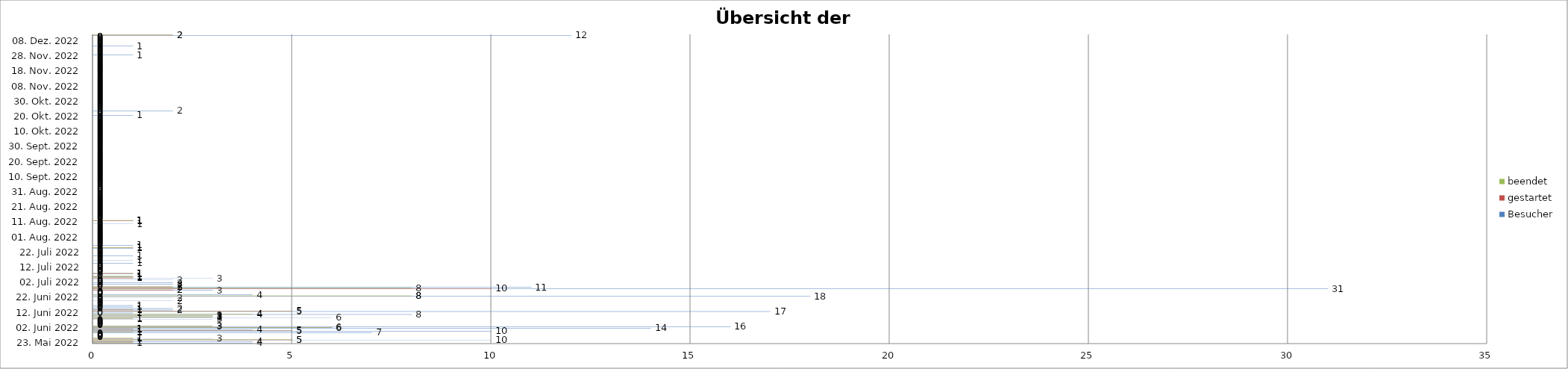
| Category | Besucher | gestartet | beendet |
|---|---|---|---|
| 23. Mai 2022 | 4 | 1 | 1 |
| 24. Mai 2022 | 4 | 1 | 1 |
| 25. Mai 2022 | 10 | 5 | 5 |
| 26. Mai 2022 | 3 | 1 | 1 |
| 27. Mai 2022 | 0 | 0 | 0 |
| 28. Mai 2022 | 0 | 0 | 0 |
| 29. Mai 2022 | 0 | 0 | 0 |
| 30. Mai 2022 | 7 | 1 | 1 |
| 31. Mai 2022 | 10 | 5 | 5 |
| 01. Juni 2022 | 4 | 1 | 1 |
| 02. Juni 2022 | 14 | 6 | 6 |
| 03. Juni 2022 | 16 | 3 | 3 |
| 04. Juni 2022 | 0 | 0 | 0 |
| 05. Juni 2022 | 0 | 0 | 0 |
| 06. Juni 2022 | 0 | 0 | 0 |
| 07. Juni 2022 | 0 | 0 | 0 |
| 08. Juni 2022 | 3 | 1 | 1 |
| 09. Juni 2022 | 6 | 3 | 3 |
| 10. Juni 2022 | 3 | 3 | 3 |
| 11. Juni 2022 | 8 | 4 | 4 |
| 12. Juni 2022 | 1 | 0 | 0 |
| 13. Juni 2022 | 17 | 5 | 5 |
| 14. Juni 2022 | 2 | 1 | 1 |
| 15. Juni 2022 | 2 | 0 | 0 |
| 16. Juni 2022 | 1 | 0 | 0 |
| 17. Juni 2022 | 1 | 0 | 0 |
| 18. Juni 2022 | 0 | 0 | 0 |
| 19. Juni 2022 | 0 | 0 | 0 |
| 20. Juni 2022 | 2 | 0 | 0 |
| 21. Juni 2022 | 0 | 0 | 0 |
| 22. Juni 2022 | 2 | 0 | 0 |
| 23. Juni 2022 | 18 | 8 | 8 |
| 24. Juni 2022 | 4 | 0 | 0 |
| 25. Juni 2022 | 0 | 0 | 0 |
| 26. Juni 2022 | 0 | 0 | 0 |
| 27. Juni 2022 | 3 | 2 | 2 |
| 28. Juni 2022 | 31 | 10 | 8 |
| 29. Juni 2022 | 11 | 2 | 2 |
| 30. Juni 2022 | 0 | 0 | 0 |
| 01. Juli 2022 | 2 | 0 | 0 |
| 02. Juli 2022 | 2 | 0 | 0 |
| 03. Juli 2022 | 0 | 0 | 0 |
| 04. Juli 2022 | 2 | 0 | 0 |
| 05. Juli 2022 | 3 | 1 | 1 |
| 06. Juli 2022 | 1 | 1 | 1 |
| 07. Juli 2022 | 0 | 0 | 0 |
| 08. Juli 2022 | 1 | 1 | 1 |
| 09. Juli 2022 | 0 | 0 | 0 |
| 10. Juli 2022 | 0 | 0 | 0 |
| 11. Juli 2022 | 0 | 0 | 0 |
| 12. Juli 2022 | 0 | 0 | 0 |
| 13. Juli 2022 | 0 | 0 | 0 |
| 14. Juli 2022 | 0 | 0 | 0 |
| 15. Juli 2022 | 1 | 0 | 0 |
| 16. Juli 2022 | 0 | 0 | 0 |
| 17. Juli 2022 | 1 | 0 | 0 |
| 18. Juli 2022 | 0 | 0 | 0 |
| 19. Juli 2022 | 0 | 0 | 0 |
| 20. Juli 2022 | 1 | 0 | 0 |
| 21. Juli 2022 | 0 | 0 | 0 |
| 22. Juli 2022 | 0 | 0 | 0 |
| 23. Juli 2022 | 0 | 0 | 0 |
| 24. Juli 2022 | 0 | 0 | 0 |
| 25. Juli 2022 | 1 | 1 | 1 |
| 26. Juli 2022 | 0 | 0 | 0 |
| 27. Juli 2022 | 1 | 0 | 0 |
| 28. Juli 2022 | 0 | 0 | 0 |
| 29. Juli 2022 | 0 | 0 | 0 |
| 30. Juli 2022 | 0 | 0 | 0 |
| 31. Juli 2022 | 0 | 0 | 0 |
| 01. Aug. 2022 | 0 | 0 | 0 |
| 02. Aug. 2022 | 0 | 0 | 0 |
| 03. Aug. 2022 | 0 | 0 | 0 |
| 04. Aug. 2022 | 0 | 0 | 0 |
| 05. Aug. 2022 | 0 | 0 | 0 |
| 06. Aug. 2022 | 0 | 0 | 0 |
| 07. Aug. 2022 | 0 | 0 | 0 |
| 08. Aug. 2022 | 0 | 0 | 0 |
| 09. Aug. 2022 | 0 | 0 | 0 |
| 10. Aug. 2022 | 1 | 0 | 0 |
| 11. Aug. 2022 | 0 | 0 | 0 |
| 12. Aug. 2022 | 1 | 1 | 1 |
| 13. Aug. 2022 | 0 | 0 | 0 |
| 14. Aug. 2022 | 0 | 0 | 0 |
| 15. Aug. 2022 | 0 | 0 | 0 |
| 16. Aug. 2022 | 0 | 0 | 0 |
| 17. Aug. 2022 | 0 | 0 | 0 |
| 18. Aug. 2022 | 0 | 0 | 0 |
| 19. Aug. 2022 | 0 | 0 | 0 |
| 20. Aug. 2022 | 0 | 0 | 0 |
| 21. Aug. 2022 | 0 | 0 | 0 |
| 22. Aug. 2022 | 0 | 0 | 0 |
| 23. Aug. 2022 | 0 | 0 | 0 |
| 24. Aug. 2022 | 0 | 0 | 0 |
| 25. Aug. 2022 | 0 | 0 | 0 |
| 26. Aug. 2022 | 0 | 0 | 0 |
| 27. Aug. 2022 | 0 | 0 | 0 |
| 28. Aug. 2022 | 0 | 0 | 0 |
| 29. Aug. 2022 | 0 | 0 | 0 |
| 30. Aug. 2022 | 0 | 0 | 0 |
| 31. Aug. 2022 | 0 | 0 | 0 |
| 01. Sept. 2022 | 0 | 0 | 0 |
| 02. Sept. 2022 | 0 | 0 | 0 |
| 03. Sept. 2022 | 0 | 0 | 0 |
| 04. Sept. 2022 | 0 | 0 | 0 |
| 05. Sept. 2022 | 0 | 0 | 0 |
| 06. Sept. 2022 | 0 | 0 | 0 |
| 07. Sept. 2022 | 0 | 0 | 0 |
| 08. Sept. 2022 | 0 | 0 | 0 |
| 09. Sept. 2022 | 0 | 0 | 0 |
| 10. Sept. 2022 | 0 | 0 | 0 |
| 11. Sept. 2022 | 0 | 0 | 0 |
| 12. Sept. 2022 | 0 | 0 | 0 |
| 13. Sept. 2022 | 0 | 0 | 0 |
| 14. Sept. 2022 | 0 | 0 | 0 |
| 15. Sept. 2022 | 0 | 0 | 0 |
| 16. Sept. 2022 | 0 | 0 | 0 |
| 17. Sept. 2022 | 0 | 0 | 0 |
| 18. Sept. 2022 | 0 | 0 | 0 |
| 19. Sept. 2022 | 0 | 0 | 0 |
| 20. Sept. 2022 | 0 | 0 | 0 |
| 21. Sept. 2022 | 0 | 0 | 0 |
| 22. Sept. 2022 | 0 | 0 | 0 |
| 23. Sept. 2022 | 0 | 0 | 0 |
| 24. Sept. 2022 | 0 | 0 | 0 |
| 25. Sept. 2022 | 0 | 0 | 0 |
| 26. Sept. 2022 | 0 | 0 | 0 |
| 27. Sept. 2022 | 0 | 0 | 0 |
| 28. Sept. 2022 | 0 | 0 | 0 |
| 29. Sept. 2022 | 0 | 0 | 0 |
| 30. Sept. 2022 | 0 | 0 | 0 |
| 01. Okt. 2022 | 0 | 0 | 0 |
| 02. Okt. 2022 | 0 | 0 | 0 |
| 03. Okt. 2022 | 0 | 0 | 0 |
| 04. Okt. 2022 | 0 | 0 | 0 |
| 05. Okt. 2022 | 0 | 0 | 0 |
| 06. Okt. 2022 | 0 | 0 | 0 |
| 07. Okt. 2022 | 0 | 0 | 0 |
| 08. Okt. 2022 | 0 | 0 | 0 |
| 09. Okt. 2022 | 0 | 0 | 0 |
| 10. Okt. 2022 | 0 | 0 | 0 |
| 11. Okt. 2022 | 0 | 0 | 0 |
| 12. Okt. 2022 | 0 | 0 | 0 |
| 13. Okt. 2022 | 0 | 0 | 0 |
| 14. Okt. 2022 | 0 | 0 | 0 |
| 15. Okt. 2022 | 0 | 0 | 0 |
| 16. Okt. 2022 | 0 | 0 | 0 |
| 17. Okt. 2022 | 0 | 0 | 0 |
| 18. Okt. 2022 | 0 | 0 | 0 |
| 19. Okt. 2022 | 0 | 0 | 0 |
| 20. Okt. 2022 | 0 | 0 | 0 |
| 21. Okt. 2022 | 1 | 0 | 0 |
| 22. Okt. 2022 | 0 | 0 | 0 |
| 23. Okt. 2022 | 0 | 0 | 0 |
| 24. Okt. 2022 | 2 | 0 | 0 |
| 25. Okt. 2022 | 0 | 0 | 0 |
| 26. Okt. 2022 | 0 | 0 | 0 |
| 27. Okt. 2022 | 0 | 0 | 0 |
| 28. Okt. 2022 | 0 | 0 | 0 |
| 29. Okt. 2022 | 0 | 0 | 0 |
| 30. Okt. 2022 | 0 | 0 | 0 |
| 30. Okt. 2022 | 0 | 0 | 0 |
| 31. Okt. 2022 | 0 | 0 | 0 |
| 01. Nov. 2022 | 0 | 0 | 0 |
| 02. Nov. 2022 | 0 | 0 | 0 |
| 03. Nov. 2022 | 0 | 0 | 0 |
| 04. Nov. 2022 | 0 | 0 | 0 |
| 05. Nov. 2022 | 0 | 0 | 0 |
| 06. Nov. 2022 | 0 | 0 | 0 |
| 07. Nov. 2022 | 0 | 0 | 0 |
| 08. Nov. 2022 | 0 | 0 | 0 |
| 09. Nov. 2022 | 0 | 0 | 0 |
| 10. Nov. 2022 | 0 | 0 | 0 |
| 11. Nov. 2022 | 0 | 0 | 0 |
| 12. Nov. 2022 | 0 | 0 | 0 |
| 13. Nov. 2022 | 0 | 0 | 0 |
| 14. Nov. 2022 | 0 | 0 | 0 |
| 15. Nov. 2022 | 0 | 0 | 0 |
| 16. Nov. 2022 | 0 | 0 | 0 |
| 17. Nov. 2022 | 0 | 0 | 0 |
| 18. Nov. 2022 | 0 | 0 | 0 |
| 19. Nov. 2022 | 0 | 0 | 0 |
| 20. Nov. 2022 | 0 | 0 | 0 |
| 21. Nov. 2022 | 0 | 0 | 0 |
| 22. Nov. 2022 | 0 | 0 | 0 |
| 23. Nov. 2022 | 0 | 0 | 0 |
| 24. Nov. 2022 | 0 | 0 | 0 |
| 25. Nov. 2022 | 0 | 0 | 0 |
| 26. Nov. 2022 | 0 | 0 | 0 |
| 27. Nov. 2022 | 0 | 0 | 0 |
| 28. Nov. 2022 | 0 | 0 | 0 |
| 29. Nov. 2022 | 1 | 0 | 0 |
| 30. Nov. 2022 | 0 | 0 | 0 |
| 01. Dez. 2022 | 0 | 0 | 0 |
| 02. Dez. 2022 | 0 | 0 | 0 |
| 03. Dez. 2022 | 0 | 0 | 0 |
| 04. Dez. 2022 | 0 | 0 | 0 |
| 05. Dez. 2022 | 1 | 0 | 0 |
| 06. Dez. 2022 | 0 | 0 | 0 |
| 07. Dez. 2022 | 0 | 0 | 0 |
| 08. Dez. 2022 | 0 | 0 | 0 |
| 09. Dez. 2022 | 0 | 0 | 0 |
| 10. Dez. 2022 | 0 | 0 | 0 |
| 11. Dez. 2022 | 0 | 0 | 0 |
| 12. Dez. 2022 | 12 | 2 | 2 |